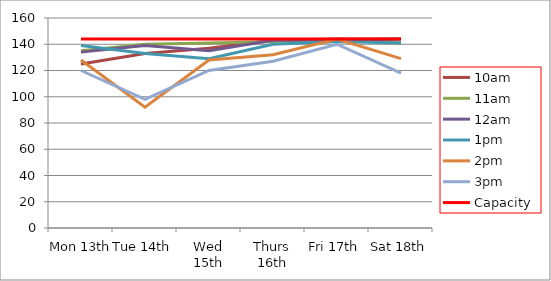
| Category | 9am | 10am | 11am | 12am | 1pm | 2pm | 3pm | 4pm | 5pm | Capacity |
|---|---|---|---|---|---|---|---|---|---|---|
| Mon 13th |  | 125 | 135 | 134 | 139 | 128 | 120 |  |  | 144 |
| Tue 14th |  | 133 | 140 | 139 | 133 | 92 | 98 |  |  | 144 |
| Wed 15th |  | 137 | 141 | 135 | 129 | 128 | 120 |  |  | 144 |
| Thurs 16th |  | 143 | 142 | 143 | 140 | 132 | 127 |  |  | 144 |
| Fri 17th |  | 144 | 144 | 143 | 142 | 144 | 140 |  |  | 144 |
| Sat 18th |  | 144 | 141 | 144 | 141 | 129 | 118 |  |  | 144 |